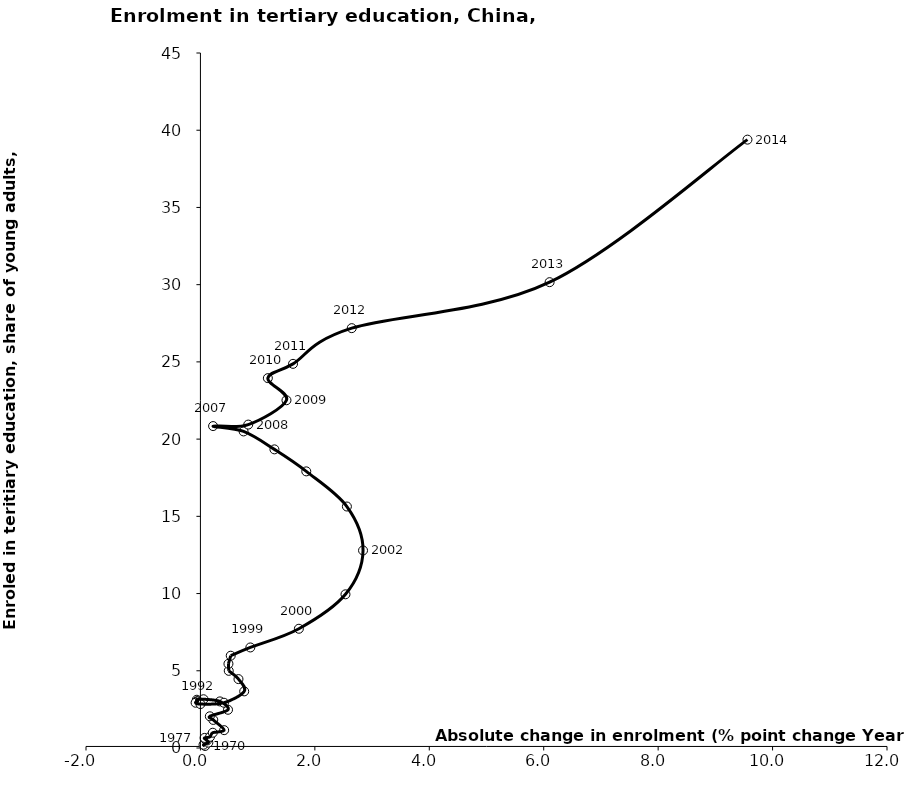
| Category | Series 0 |
|---|---|
| 0.08116000890731798 | 0.131 |
| 0.0541900023818015 | 0.212 |
| 0.13808000087738 | 0.348 |
| 0.11553500592708602 | 0.488 |
| 0.08226999640464802 | 0.579 |
| 0.07249000668525696 | 0.653 |
| 0.16787001490592945 | 0.724 |
| 0.2155399918556225 | 0.989 |
| 0.41475000977516197 | 1.155 |
| 0.22441500425338756 | 1.818 |
| 0.16430750489235008 | 2.053 |
| 0.4820749759674048 | 2.475 |
| 0.3408999443054199 | 3.017 |
| 0.05396997928619518 | 3.157 |
| -0.06242001056671498 | 3.125 |
| -0.05615496635437012 | 3.032 |
| -0.050759911537169966 | 3.012 |
| -0.08429002761840998 | 2.931 |
| 0.0 | 2.844 |
| 0.4113750457763701 | 2.931 |
| 0.7650799751281747 | 3.667 |
| 0.6650050878524751 | 4.461 |
| 0.49492001533508523 | 4.997 |
| 0.48961496353149503 | 5.451 |
| 0.5295200347900351 | 5.976 |
| 0.8722999095916748 | 6.51 |
| 1.7206799983978303 | 7.72 |
| 2.53528022766112 | 9.951 |
| 2.84224510192871 | 12.791 |
| 2.5599946975708 | 15.636 |
| 1.8500294685364 | 17.911 |
| 1.29333019256595 | 19.336 |
| 0.7543354034423491 | 20.498 |
| 0.22114467620849965 | 20.845 |
| 0.8357152938843004 | 20.94 |
| 1.503970146179201 | 22.516 |
| 1.1784248352050497 | 23.948 |
| 1.6182546615600497 | 24.873 |
| 2.6446294784546005 | 27.184 |
| 6.102979660034151 | 30.162 |
| 9.561329841613702 | 39.39 |